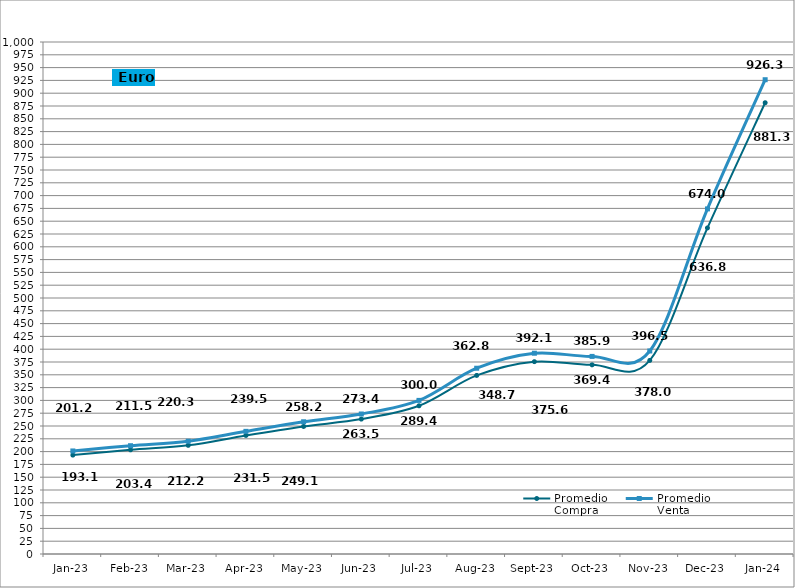
| Category | Promedio
Compra  | Promedio
Venta |
|---|---|---|
| 2023-01-01 | 193.176 | 201.252 |
| 2023-02-01 | 203.439 | 211.522 |
| 2023-03-01 | 212.222 | 220.297 |
| 2023-04-01 | 231.571 | 239.556 |
| 2023-05-01 | 249.126 | 258.248 |
| 2023-06-01 | 263.5 | 273.471 |
| 2023-07-01 | 289.467 | 300.025 |
| 2023-08-01 | 348.76 | 362.82 |
| 2023-09-01 | 375.65 | 392.125 |
| 2023-10-01 | 369.444 | 385.919 |
| 2023-11-01 | 378.072 | 396.531 |
| 2023-12-01 | 636.835 | 674.037 |
| 2024-01-01 | 881.34 | 926.34 |